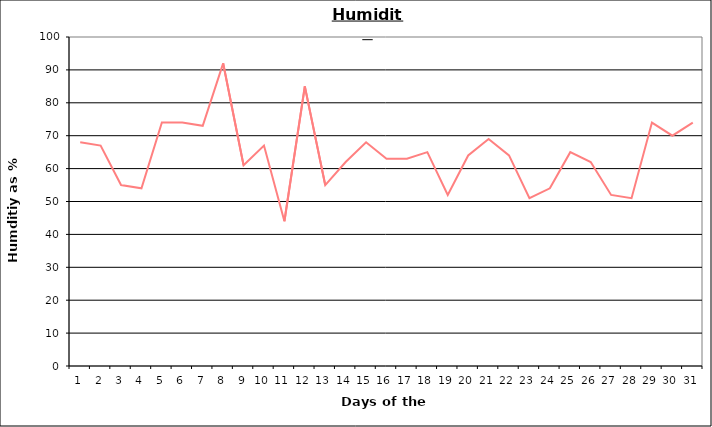
| Category | Series 0 |
|---|---|
| 0 | 68 |
| 1 | 67 |
| 2 | 55 |
| 3 | 54 |
| 4 | 74 |
| 5 | 74 |
| 6 | 73 |
| 7 | 92 |
| 8 | 61 |
| 9 | 67 |
| 10 | 44 |
| 11 | 85 |
| 12 | 55 |
| 13 | 62 |
| 14 | 68 |
| 15 | 63 |
| 16 | 63 |
| 17 | 65 |
| 18 | 52 |
| 19 | 64 |
| 20 | 69 |
| 21 | 64 |
| 22 | 51 |
| 23 | 54 |
| 24 | 65 |
| 25 | 62 |
| 26 | 52 |
| 27 | 51 |
| 28 | 74 |
| 29 | 70 |
| 30 | 74 |